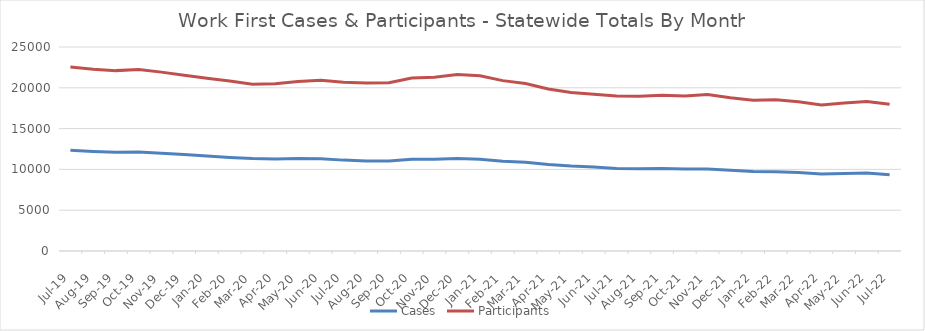
| Category | Cases | Participants |
|---|---|---|
| 2022-07-22 | 9349 | 17973 |
| 2022-06-22 | 9561 | 18334 |
| 2022-05-22 | 9493 | 18139 |
| 2022-04-22 | 9434 | 17898 |
| 2022-03-22 | 9625 | 18293 |
| 2022-02-22 | 9713 | 18537 |
| 2022-01-22 | 9733 | 18484 |
| 2021-12-21 | 9885 | 18776 |
| 2021-11-21 | 10056 | 19192 |
| 2021-10-21 | 10034 | 19005 |
| 2021-09-21 | 10102 | 19085 |
| 2021-08-21 | 10090 | 18974 |
| 2021-07-21 | 10121 | 18988 |
| 2021-06-21 | 10298 | 19211 |
| 2021-05-21 | 10411 | 19413 |
| 2021-04-21 | 10601 | 19845 |
| 2021-03-21 | 10888 | 20521 |
| 2021-02-21 | 11007 | 20877 |
| 2021-01-21 | 11252 | 21466 |
| 2020-12-20 | 11350 | 21641 |
| 2020-11-20 | 11255 | 21305 |
| 2020-10-20 | 11243 | 21198 |
| 2020-09-20 | 11030 | 20626 |
| 2020-08-20 | 11034 | 20575 |
| 2020-07-20 | 11137 | 20693 |
| 2020-06-20 | 11320 | 20921 |
| 2020-05-20 | 11330 | 20766 |
| 2020-04-20 | 11263 | 20490 |
| 2020-03-20 | 11330 | 20431 |
| 2020-02-20 | 11473 | 20821 |
| 2020-01-20 | 11654 | 21174 |
| 2019-12-19 | 11822 | 21539 |
| 2019-11-19 | 11990 | 21921 |
| 2019-10-19 | 12136 | 22233 |
| 2019-09-19 | 12092 | 22105 |
| 2019-08-19 | 12206 | 22284 |
| 2019-07-19 | 12346 | 22563 |